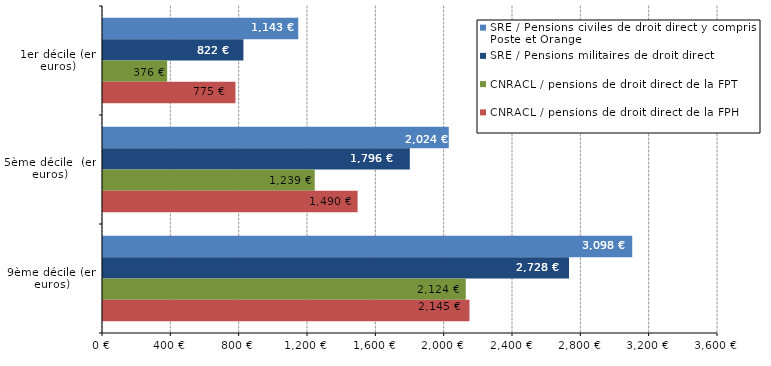
| Category | SRE / Pensions civiles de droit direct y compris La Poste et Orange | SRE / Pensions militaires de droit direct | CNRACL / pensions de droit direct de la FPT | CNRACL / pensions de droit direct de la FPH |
|---|---|---|---|---|
| 1er décile (en euros) | 1143 | 822 | 375.5 | 775.3 |
| 5ème décile  (en euros) | 2024 | 1796 | 1239.4 | 1490.4 |
| 9ème décile (en euros) | 3098 | 2728 | 2123.5 | 2145.2 |